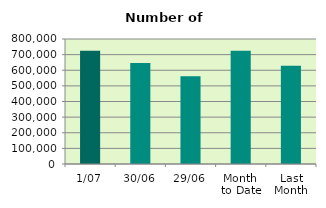
| Category | Series 0 |
|---|---|
| 1/07 | 724884 |
| 30/06 | 646026 |
| 29/06 | 561280 |
| Month 
to Date | 724884 |
| Last
Month | 628899 |